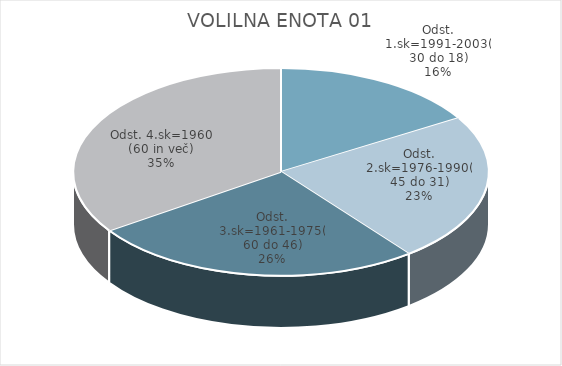
| Category | VOLILNA ENOTA 1 |
|---|---|
| Odst. 1.sk=1991-2003(30 do 18) | 8.19 |
| Odst. 2.sk=1976-1990(45 do 31) | 11.63 |
| Odst. 3.sk=1961-1975(60 do 46) | 13.04 |
| Odst. 4.sk=1960 (60 in več) | 17.34 |